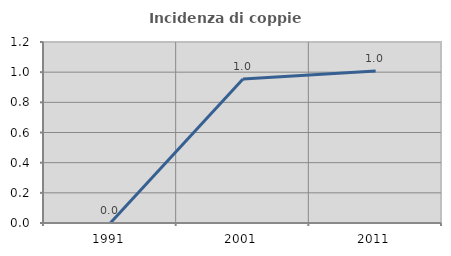
| Category | Incidenza di coppie miste |
|---|---|
| 1991.0 | 0 |
| 2001.0 | 0.955 |
| 2011.0 | 1.008 |